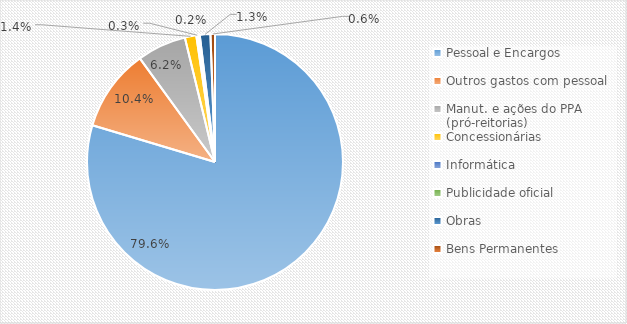
| Category | Series 0 |
|---|---|
| Pessoal e Encargos | 0.796 |
| Outros gastos com pessoal | 0.104 |
| Manut. e ações do PPA (pró-reitorias) | 0.062 |
| Concessionárias  | 0.014 |
| Informática | 0.003 |
| Publicidade oficial | 0.002 |
| Obras | 0.013 |
| Bens Permanentes | 0.006 |